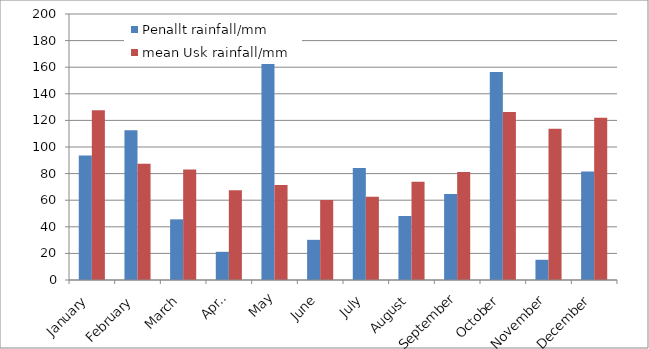
| Category | Penallt rainfall/mm | mean Usk rainfall/mm |
|---|---|---|
| January | 93.6 | 127.6 |
| February | 112.6 | 87.4 |
| March | 45.6 | 83.1 |
| April | 21.2 | 67.5 |
| May | 185.4 | 71.5 |
| June | 30.2 | 60.2 |
| July | 84.2 | 62.6 |
| August | 48.2 | 73.9 |
| September | 64.6 | 81.2 |
| October | 156.4 | 126.3 |
| November | 15.2 | 113.7 |
| December | 81.6 | 121.9 |